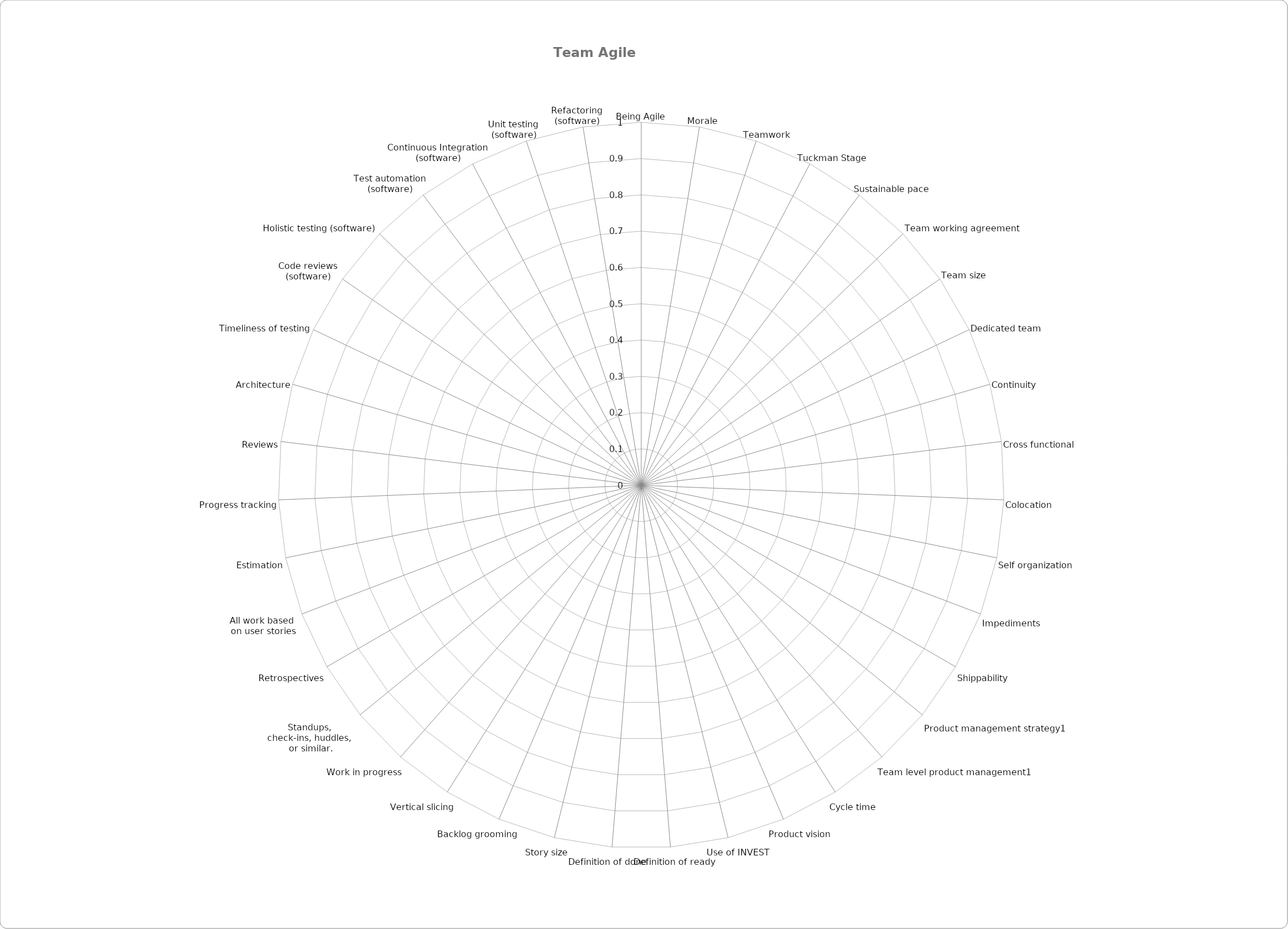
| Category | Series 0 |
|---|---|
| 
Being Agile | 0 |
| 
Morale | 0 |
| 
Teamwork | 0 |
| 
Tuckman Stage | 0 |
| 
Sustainable pace | 0 |
| 
Team working agreement | 0 |
| 
Team size | 0 |
| 
Dedicated team | 0 |
| 
Continuity | 0 |
| 
Cross functional | 0 |
| 
Colocation | 0 |
| 
Self organization | 0 |
| 
Impediments | 0 |
| 
Shippability | 0 |
| 
Product management strategy1 | 0 |
| 
Team level product management1 | 0 |
| 
Cycle time | 0 |
| 
Product vision | 0 |
| 
Use of INVEST | 0 |
| 
Definition of ready | 0 |
| 
Definition of done | 0 |
| 
Story size | 0 |
| 
Backlog grooming | 0 |
| 
Vertical slicing | 0 |
| 
Work in progress | 0 |
| 
Standups, 
check-ins, huddles, 
or similar. | 0 |
| 
Retrospectives | 0 |
| 
All work based 
on user stories | 0 |
| 
Estimation | 0 |
| 
Progress tracking | 0 |
| 
Reviews | 0 |
| 
Architecture | 0 |
| 
Timeliness of testing | 0 |
| 
Code reviews
(software) | 0 |
| 
Holistic testing (software) | 0 |
| 
Test automation
(software) | 0 |
| 
Continuous Integration
(software) | 0 |
| 
Unit testing
(software) | 0 |
| 
Refactoring
(software) | 0 |